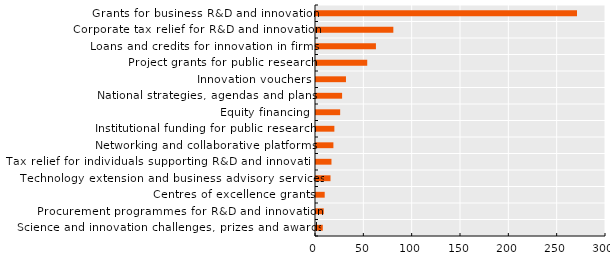
| Category | Series 0 |
|---|---|
| Science and innovation challenges, prizes and awards | 7 |
| Procurement programmes for R&D and innovation | 8 |
| Centres of excellence grants | 9 |
| Technology extension and business advisory services | 15 |
| Tax relief for individuals supporting R&D and innovation | 16 |
| Networking and collaborative platforms | 18 |
| Institutional funding for public research | 19 |
| Equity financing | 25 |
| National strategies, agendas and plans | 27 |
| Innovation vouchers | 31 |
| Project grants for public research | 53 |
| Loans and credits for innovation in firms | 62 |
| Corporate tax relief for R&D and innovation | 80 |
| Grants for business R&D and innovation | 270 |